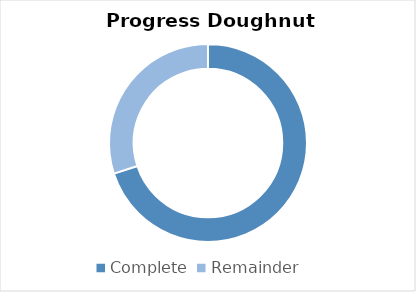
| Category | Series 0 |
|---|---|
| Complete | 0.7 |
| Remainder | 0.3 |